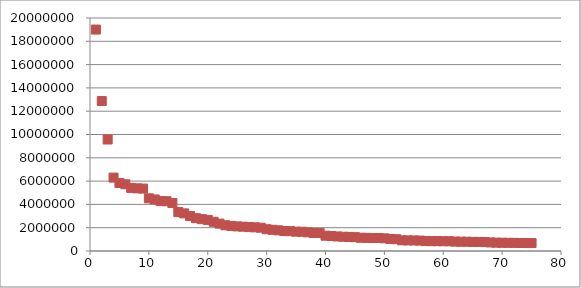
| Category | Populations |
|---|---|
| 1.0 | 19006798 |
| 2.0 | 12872808 |
| 3.0 | 9569624 |
| 4.0 | 6300006 |
| 5.0 | 5838471 |
| 6.0 | 5728143 |
| 7.0 | 5414772 |
| 8.0 | 5376285 |
| 9.0 | 5358130 |
| 10.0 | 4522858 |
| 11.0 | 4425110 |
| 12.0 | 4281899 |
| 13.0 | 4274531 |
| 14.0 | 4115871 |
| 15.0 | 3344813 |
| 16.0 | 3229878 |
| 17.0 | 3001072 |
| 18.0 | 2816710 |
| 19.0 | 2733761 |
| 20.0 | 2667117 |
| 21.0 | 2506626 |
| 22.0 | 2351192 |
| 23.0 | 2207462 |
| 24.0 | 2155137 |
| 25.0 | 2109832 |
| 26.0 | 2088291 |
| 27.0 | 2054574 |
| 28.0 | 2031445 |
| 29.0 | 2002047 |
| 30.0 | 1865746 |
| 31.0 | 1819198 |
| 32.0 | 1773120 |
| 33.0 | 1715459 |
| 34.0 | 1701799 |
| 35.0 | 1658292 |
| 36.0 | 1652602 |
| 37.0 | 1600611 |
| 38.0 | 1550733 |
| 39.0 | 1549308 |
| 40.0 | 1313228 |
| 41.0 | 1285732 |
| 42.0 | 1244696 |
| 43.0 | 1225626 |
| 44.0 | 1206142 |
| 45.0 | 1190512 |
| 46.0 | 1134029 |
| 47.0 | 1124309 |
| 48.0 | 1117608 |
| 49.0 | 1115692 |
| 50.0 | 1088765 |
| 51.0 | 1034090 |
| 52.0 | 1012018 |
| 53.0 | 916079 |
| 54.0 | 909153 |
| 55.0 | 905034 |
| 56.0 | 895030 |
| 57.0 | 853919 |
| 58.0 | 846101 |
| 59.0 | 845913 |
| 60.0 | 837925 |
| 61.0 | 836544 |
| 62.0 | 808210 |
| 63.0 | 800458 |
| 64.0 | 797740 |
| 65.0 | 781352 |
| 66.0 | 776742 |
| 67.0 | 770037 |
| 68.0 | 734669 |
| 69.0 | 716030 |
| 70.0 | 710514 |
| 71.0 | 699356 |
| 72.0 | 698497 |
| 73.0 | 687181 |
| 74.0 | 682657 |
| 75.0 | 681525 |